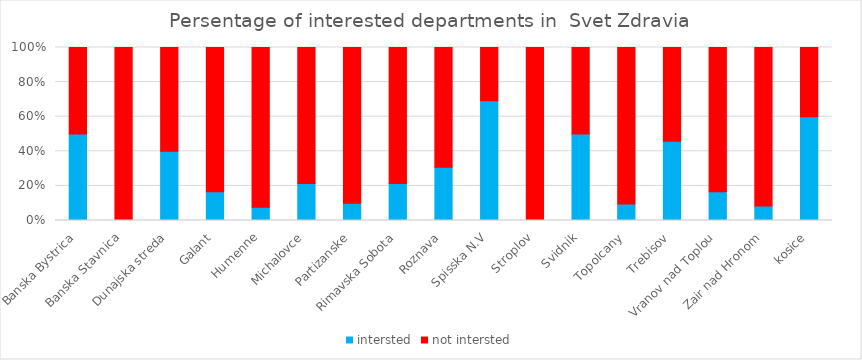
| Category | intersted  | not intersted |
|---|---|---|
| Banska Bystrica | 1 | 1 |
| Banska Stavnica | 0 | 3 |
| Dunajska streda | 6 | 9 |
| Galant | 3 | 15 |
| Humenne | 1 | 12 |
| Michalovce | 6 | 22 |
| Partizanske | 1 | 9 |
| Rimavska Sobota | 3 | 11 |
| Roznava | 4 | 9 |
| Spisska N.V | 9 | 4 |
| Stroplov | 0 | 2 |
| Svidnik | 5 | 5 |
| Topolcany | 2 | 19 |
| Trebisov | 11 | 13 |
| Vranov nad Toplou | 2 | 10 |
| Zair nad Hronom | 1 | 11 |
| kosice | 6 | 4 |